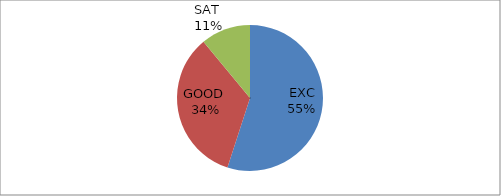
| Category | Series 0 |
|---|---|
| EXC | 55 |
| GOOD  | 34 |
| SAT  | 11 |